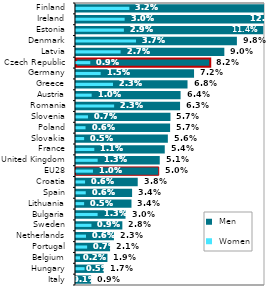
| Category |  Men |
|---|---|
| Italy | 0.009 |
| Hungary | 0.017 |
| Belgium | 0.019 |
| Portugal | 0.021 |
| Netherlands | 0.023 |
| Sweden | 0.028 |
| Bulgaria | 0.03 |
| Lithuania | 0.034 |
| Spain | 0.034 |
| Croatia | 0.038 |
| EU28 | 0.05 |
| United Kingdom | 0.051 |
| France | 0.054 |
| Slovakia | 0.056 |
| Poland | 0.057 |
| Slovenia | 0.057 |
| Romania | 0.063 |
| Austria | 0.064 |
| Greece | 0.068 |
| Germany | 0.072 |
| Czech Republic | 0.082 |
| Latvia | 0.09 |
| Denmark | 0.098 |
| Estonia | 0.114 |
| Ireland | 0.128 |
| Finland | 0.152 |